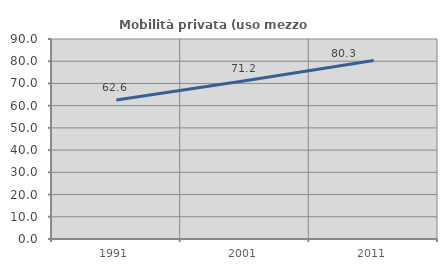
| Category | Mobilità privata (uso mezzo privato) |
|---|---|
| 1991.0 | 62.562 |
| 2001.0 | 71.249 |
| 2011.0 | 80.348 |